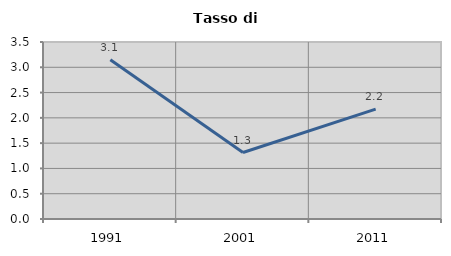
| Category | Tasso di disoccupazione   |
|---|---|
| 1991.0 | 3.149 |
| 2001.0 | 1.315 |
| 2011.0 | 2.174 |